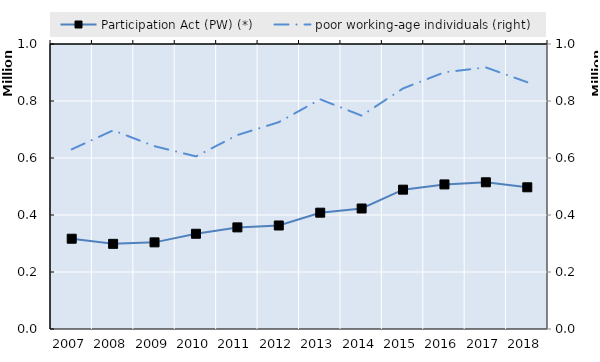
| Category | Participation Act (PW) (*) | 0 | Series 14 | Series 15 | Series 16 | Series 17 | Series 18 | Series 19 |
|---|---|---|---|---|---|---|---|---|
| 2007.0 | 316770 |  |  |  |  |  |  |  |
| 2008.0 | 298790 |  |  |  |  |  |  |  |
| 2009.0 | 304000 |  |  |  |  |  |  |  |
| 2010.0 | 334200 |  |  |  |  |  |  |  |
| 2011.0 | 356532.5 |  |  |  |  |  |  |  |
| 2012.0 | 363185 |  |  |  |  |  |  |  |
| 2013.0 | 408150 |  |  |  |  |  |  |  |
| 2014.0 | 422850 |  |  |  |  |  |  |  |
| 2015.0 | 488910 |  |  |  |  |  |  |  |
| 2016.0 | 507293 |  |  |  |  |  |  |  |
| 2017.0 | 514777.5 |  |  |  |  |  |  |  |
| 2018.0 | 497205.8 |  |  |  |  |  |  |  |